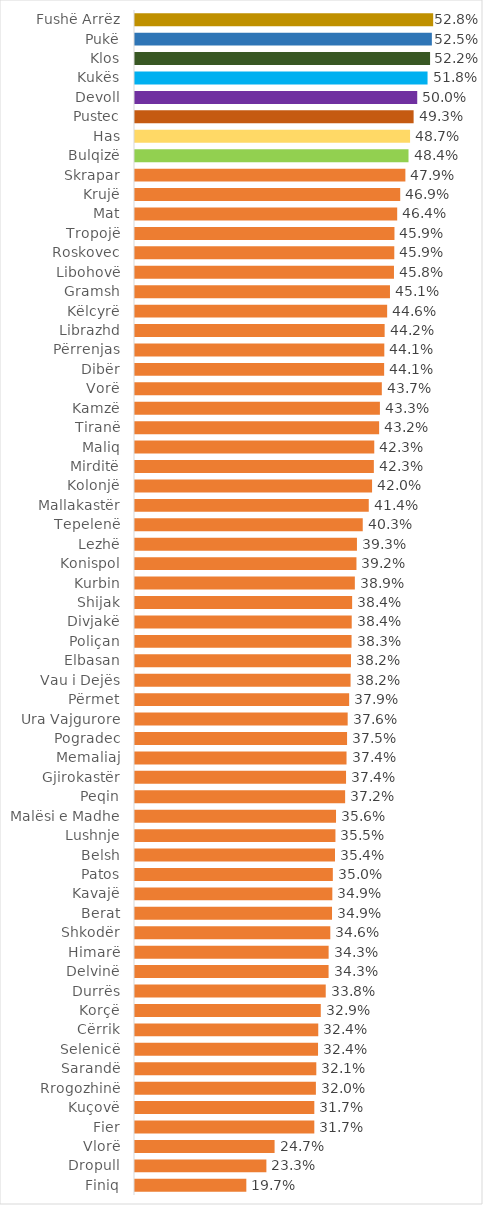
| Category | Pjesëmarrja % |
|---|---|
| Fushë Arrëz | 0.528 |
| Pukë | 0.525 |
| Klos | 0.522 |
| Kukës | 0.518 |
| Devoll | 0.5 |
| Pustec | 0.493 |
| Has | 0.487 |
| Bulqizë | 0.484 |
| Skrapar | 0.479 |
| Krujë | 0.469 |
| Mat | 0.464 |
| Tropojë | 0.459 |
| Roskovec | 0.459 |
| Libohovë | 0.458 |
| Gramsh | 0.451 |
| Këlcyrë | 0.446 |
| Librazhd | 0.442 |
| Përrenjas | 0.441 |
| Dibër | 0.441 |
| Vorë | 0.437 |
| Kamzë | 0.433 |
| Tiranë | 0.432 |
| Maliq | 0.423 |
| Mirditë | 0.423 |
| Kolonjë | 0.42 |
| Mallakastër | 0.414 |
| Tepelenë | 0.403 |
| Lezhë | 0.393 |
| Konispol | 0.392 |
| Kurbin | 0.389 |
| Shijak | 0.384 |
| Divjakë | 0.384 |
| Poliçan | 0.383 |
| Elbasan | 0.382 |
| Vau i Dejës | 0.382 |
| Përmet | 0.379 |
| Ura Vajgurore | 0.376 |
| Pogradec | 0.375 |
| Memaliaj | 0.374 |
| Gjirokastër | 0.374 |
| Peqin | 0.372 |
| Malësi e Madhe | 0.356 |
| Lushnje | 0.355 |
| Belsh | 0.354 |
| Patos | 0.35 |
| Kavajë | 0.349 |
| Berat | 0.349 |
| Shkodër | 0.346 |
| Himarë | 0.343 |
| Delvinë | 0.343 |
| Durrës | 0.338 |
| Korçë | 0.329 |
| Cërrik | 0.324 |
| Selenicë | 0.324 |
| Sarandë | 0.321 |
| Rrogozhinë | 0.32 |
| Kuçovë | 0.317 |
| Fier | 0.317 |
| Vlorë | 0.247 |
| Dropull | 0.233 |
| Finiq | 0.197 |